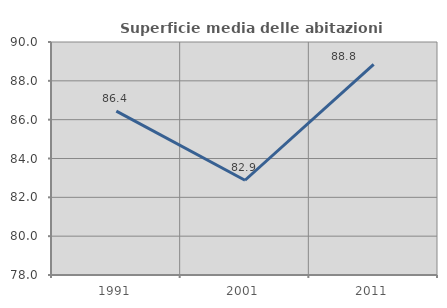
| Category | Superficie media delle abitazioni occupate |
|---|---|
| 1991.0 | 86.436 |
| 2001.0 | 82.88 |
| 2011.0 | 88.842 |